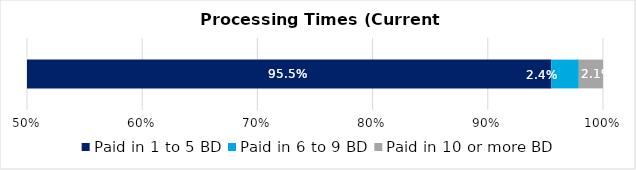
| Category | Paid in 1 to 5 BD | Paid in 6 to 9 BD | Paid in 10 or more BD |
|---|---|---|---|
| 0 | 0.955 | 0.024 | 0.021 |